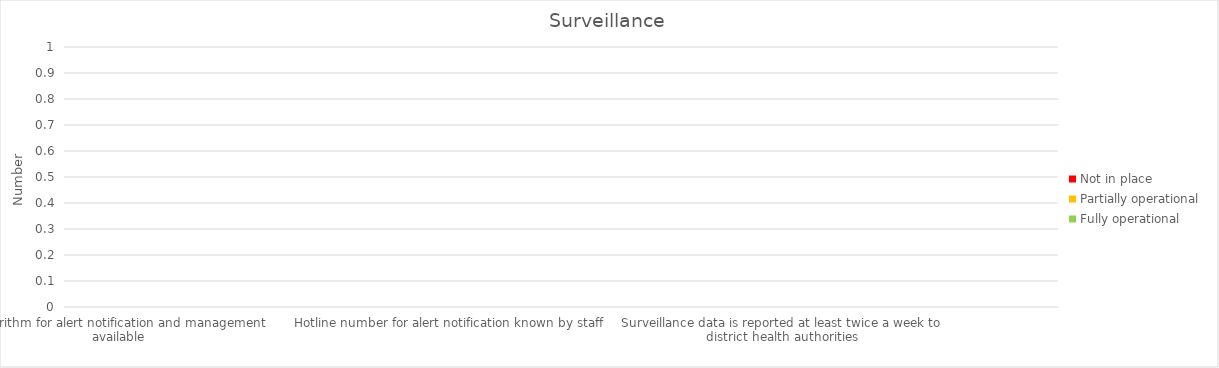
| Category | Fully operational | Partially operational | Not in place |
|---|---|---|---|
| Algorithm for alert notification and management available | 0 | 0 | 0 |
| COVID-19 Official case definition available | 0 | 0 | 0 |
| Case investigation form available | 0 | 0 | 0 |
| Hotline number for alert notification known by staff | 0 | 0 | 0 |
| Surveillance system in place to collect and receive information on number of suspected cases in the catchment area | 0 | 0 | 0 |
| COVID-19 surveillance data is collected by community health workers  | 0 | 0 | 0 |
| Surveillance data is reported at least twice a week to district health authorities | 0 | 0 | 0 |
| Surveillance data is tracked and monitored over time | 0 | 0 | 0 |
| Surveillance data is tracked and monitored over time | 0 | 0 | 0 |